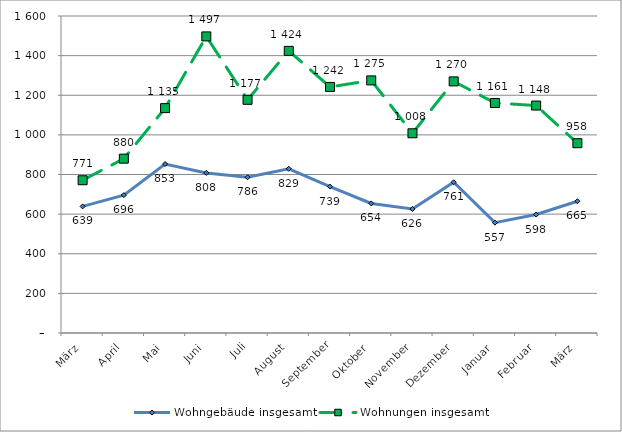
| Category | Wohngebäude insgesamt | Wohnungen insgesamt |
|---|---|---|
| März | 639 | 771 |
| April | 696 | 880 |
| Mai | 853 | 1135 |
| Juni | 808 | 1497 |
| Juli | 786 | 1177 |
| August | 829 | 1424 |
| September | 739 | 1242 |
| Oktober | 654 | 1275 |
| November | 626 | 1008 |
| Dezember | 761 | 1270 |
| Januar | 557 | 1161 |
| Februar | 598 | 1148 |
| März | 665 | 958 |